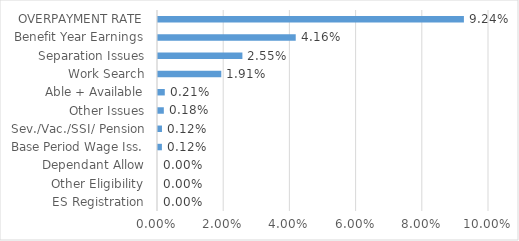
| Category | Series 0 |
|---|---|
| ES Registration | 0 |
| Other Eligibility | 0 |
| Dependant Allow | 0 |
| Base Period Wage Iss. | 0.001 |
| Sev./Vac./SSI/ Pension | 0.001 |
| Other Issues | 0.002 |
| Able + Available | 0.002 |
| Work Search | 0.019 |
| Separation Issues | 0.026 |
| Benefit Year Earnings | 0.042 |
| OVERPAYMENT RATE | 0.092 |